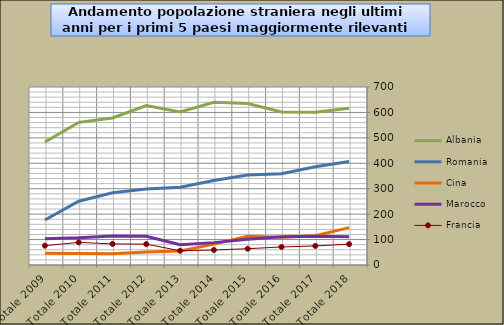
| Category | Series 1 | Albania | Romania | Cina | Marocco | Francia |
|---|---|---|---|---|---|---|
| Totale 2018 |  | 616 | 407 | 147 | 111 | 82 |
| Totale 2017 |  | 601 | 386 | 115 | 113 | 75 |
| Totale 2016 |  | 602 | 359 | 109 | 111 | 71 |
| Totale 2015 |  | 635 | 354 | 113 | 101 | 64 |
| Totale 2014 |  | 640 | 332 | 82 | 88 | 59 |
| Totale 2013 |  | 602 | 306 | 55 | 80 | 56 |
| Totale 2012 |  | 627 | 299 | 51 | 113 | 82 |
| Totale 2011 |  | 578 | 284 | 44 | 114 | 83 |
| Totale 2010 |  | 561 | 251 | 45 | 107 | 89 |
| Totale 2009 |  | 484 | 177 | 46 | 103 | 76 |